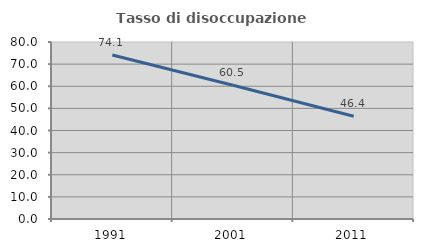
| Category | Tasso di disoccupazione giovanile  |
|---|---|
| 1991.0 | 74.148 |
| 2001.0 | 60.461 |
| 2011.0 | 46.421 |